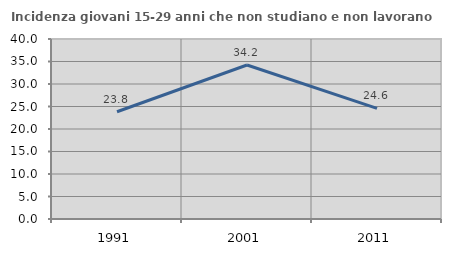
| Category | Incidenza giovani 15-29 anni che non studiano e non lavorano  |
|---|---|
| 1991.0 | 23.834 |
| 2001.0 | 34.222 |
| 2011.0 | 24.57 |